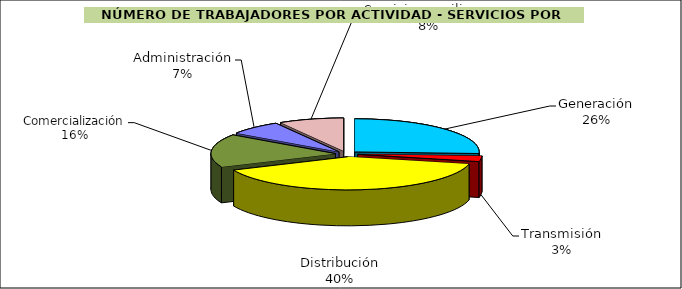
| Category | Series 0 |
|---|---|
| Generación | 25.775 |
| Transmisión | 2.76 |
| Distribución | 39.896 |
| Comercialización | 16.16 |
| Administración | 6.953 |
| Servicios auxiliares | 8.456 |